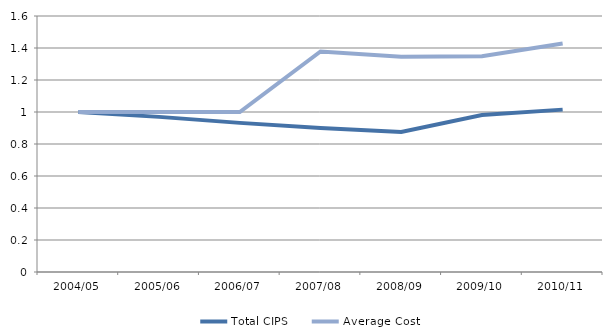
| Category | Total CIPS | Average Cost |
|---|---|---|
| 2004/05 | 1 | 1 |
| 2005/06 | 0.97 | 1 |
| 2006/07 | 0.932 | 1 |
| 2007/08 | 0.899 | 1.378 |
| 2008/09 | 0.876 | 1.345 |
| 2009/10 | 0.981 | 1.349 |
| 2010/11 | 1.015 | 1.428 |